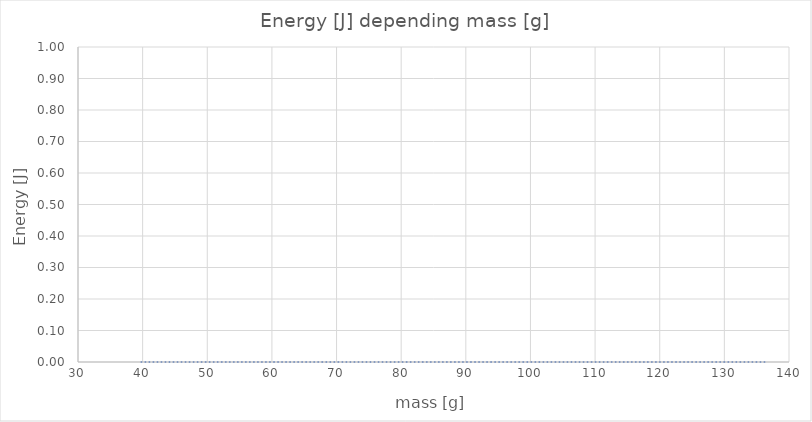
| Category | energy [J] |
|---|---|
| 39.8 | 0 |
| 48.0 | 0 |
| 56.199999999999996 | 0 |
| 64.0 | 0 |
| 64.39999999999999 | 0 |
| 72.2 | 0 |
| 72.6 | 0 |
| 80.4 | 0 |
| 88.19999999999999 | 0 |
| 88.6 | 0 |
| 96.39999999999999 | 0 |
| 104.6 | 0 |
| 112.39999999999999 | 0 |
| 120.6 | 0 |
| 136.6 | 0 |